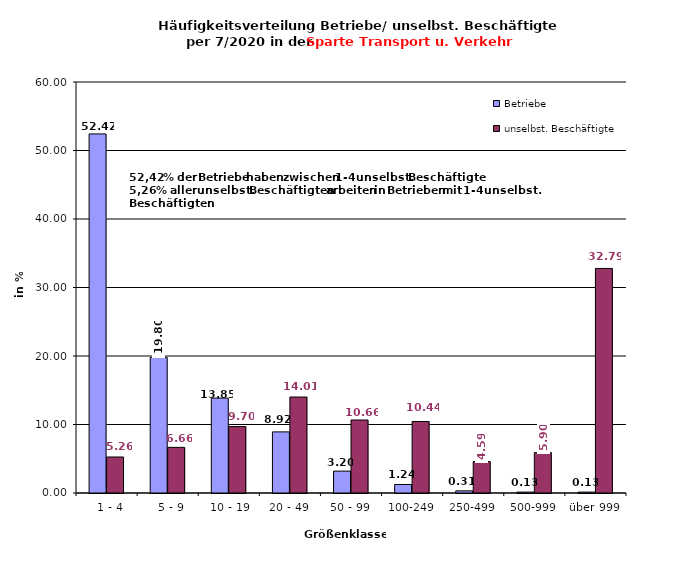
| Category | Betriebe | unselbst. Beschäftigte |
|---|---|---|
|   1 - 4 | 52.419 | 5.256 |
|   5 - 9 | 19.796 | 6.662 |
|  10 - 19 | 13.848 | 9.697 |
| 20 - 49 | 8.921 | 14.012 |
| 50 - 99 | 3.196 | 10.658 |
| 100-249 | 1.243 | 10.439 |
| 250-499 | 0.311 | 4.593 |
| 500-999 | 0.133 | 5.899 |
| über 999 | 0.133 | 32.785 |